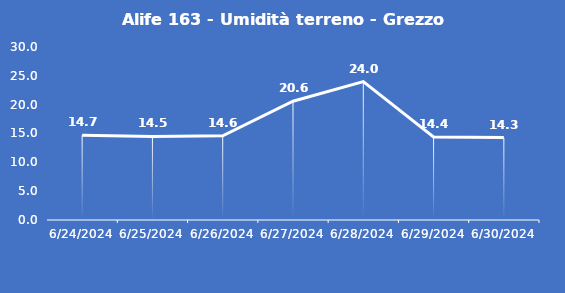
| Category | Alife 163 - Umidità terreno - Grezzo (%VWC) |
|---|---|
| 6/24/24 | 14.7 |
| 6/25/24 | 14.5 |
| 6/26/24 | 14.6 |
| 6/27/24 | 20.6 |
| 6/28/24 | 24 |
| 6/29/24 | 14.4 |
| 6/30/24 | 14.3 |